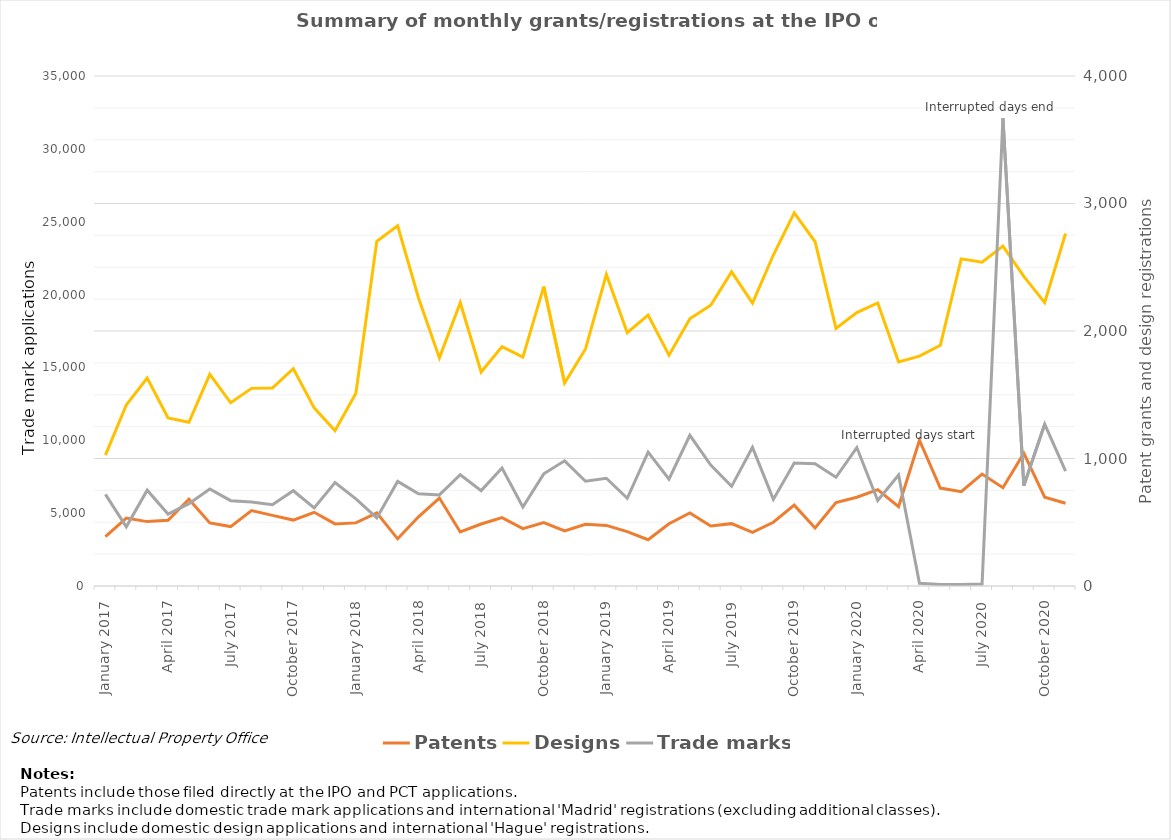
| Category | Patents | Designs |
|---|---|---|
| January 2017 | 387 | 1026 |
| February 2017 | 533 | 1420 |
| March 2017 | 505 | 1631 |
| April 2017 | 516 | 1318 |
| May 2017 | 681 | 1284 |
| June 2017 | 495 | 1660 |
| July 2017 | 466 | 1437 |
| August 2017 | 592 | 1550 |
| September 2017 | 554 | 1553 |
| October 2017 | 517 | 1705 |
| November 2017 | 578 | 1397 |
| December 2017 | 487 | 1218 |
| January 2018 | 495 | 1512 |
| February 2018 | 574 | 2704 |
| March 2018 | 370 | 2825 |
| April 2018 | 543 | 2259 |
| May 2018 | 690 | 1789 |
| June 2018 | 424 | 2222 |
| July 2018 | 486 | 1678 |
| August 2018 | 536 | 1878 |
| September 2018 | 450 | 1795 |
| October 2018 | 498 | 2348 |
| November 2018 | 432 | 1592 |
| December 2018 | 484 | 1859 |
| January 2019 | 475 | 2444 |
| February 2019 | 426 | 1987 |
| March 2019 | 363 | 2125 |
| April 2019 | 488 | 1810 |
| May 2019 | 573 | 2096 |
| June 2019 | 471 | 2202 |
| July 2019 | 489 | 2464 |
| August 2019 | 420 | 2219 |
| September 2019 | 500 | 2596 |
| October 2019 | 634 | 2926 |
| November 2019 | 455 | 2700 |
| December 2019 | 654 | 2021 |
| January 2020 | 696 | 2145 |
| February 2020 | 756 | 2220 |
| March 2020 | 622 | 1758 |
| April 2020 | 1143 | 1803 |
| May 2020 | 768 | 1888 |
| June 2020 | 740 | 2566 |
| July 2020 | 878 | 2539 |
| August 2020 | 771 | 2666 |
| September 2020 | 1042 | 2428 |
| October 2020 | 697 | 2223 |
| November 2020 | 649 | 2765 |